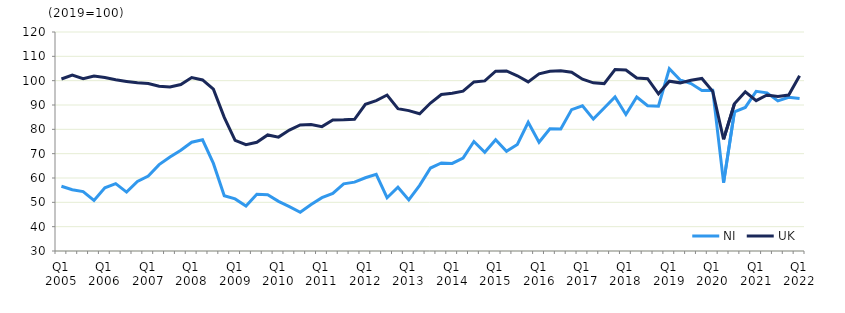
| Category | NI | UK  |
|---|---|---|
| Q1 2005 | 56.6 | 100.7 |
|  | 55.2 | 102.3 |
| Q3 2005 | 54.4 | 100.8 |
|  | 50.8 | 101.9 |
| Q1 2006 | 56 | 101.3 |
|  | 57.7 | 100.4 |
| Q3 2006 | 54.2 | 99.7 |
|  | 58.6 | 99.1 |
| Q1 2007 | 60.8 | 98.8 |
|  | 65.5 | 97.7 |
| Q3 2007 | 68.6 | 97.4 |
|  | 71.4 | 98.4 |
| Q1 2008 | 74.7 | 101.3 |
|  | 75.7 | 100.3 |
| Q3 2008 | 66 | 96.5 |
|  | 52.7 | 84.9 |
| Q1 2009 | 51.4 | 75.5 |
|  | 48.5 | 73.7 |
| Q3 2009 | 53.3 | 74.7 |
|  | 53.1 | 77.7 |
| Q1 2010 | 50.4 | 76.8 |
|  | 48.2 | 79.7 |
| Q3 2010 | 45.9 | 81.8 |
|  | 49.1 | 82 |
| Q1 2011 | 51.9 | 81.1 |
|  | 53.7 | 83.8 |
| Q3 2011 | 57.6 | 83.9 |
|  | 58.3 | 84.1 |
| Q1 2012 | 60.1 | 90.3 |
|  | 61.5 | 91.8 |
| Q3 2012 | 51.9 | 94.1 |
|  | 56.2 | 88.5 |
| Q1 2013 | 51 | 87.7 |
|  | 57 | 86.4 |
| Q3 2013 | 64.1 | 90.8 |
|  | 66.2 | 94.3 |
| Q1 2014 | 66 | 94.8 |
|  | 68.2 | 95.7 |
| Q3 2014 | 75 | 99.5 |
|  | 70.6 | 99.9 |
| Q1 2015 | 75.7 | 103.9 |
|  | 71 | 104 |
| Q3 2015 | 73.8 | 102 |
|  | 82.9 | 99.5 |
| Q1 2016 | 74.7 | 102.8 |
|  | 80.2 | 103.9 |
| Q3 2016 | 80.1 | 104.1 |
|  | 88.1 | 103.5 |
| Q1 2017 | 89.7 | 100.6 |
|  | 84.2 | 99.1 |
| Q3 2017 | 88.8 | 98.8 |
|  | 93.3 | 104.6 |
| Q1 2018 | 86.1 | 104.4 |
|  | 93.3 | 101.1 |
| Q3 2018 | 89.7 | 100.8 |
|  | 89.5 | 94.6 |
| Q1 2019 | 104.9 | 99.8 |
|  | 100.3 | 99.1 |
| Q3 2019 | 98.8 | 100.2 |
|  | 96 | 100.9 |
| Q1 2020 | 96.1 | 95.6 |
|  | 58.1 | 75.9 |
| Q3 2020 | 87.2 | 90.5 |
|  | 89 | 95.4 |
| Q1 2021 | 95.6 | 91.8 |
|  | 95 | 94.1 |
| Q3 2021 | 91.7 | 93.5 |
|  | 93.2 | 94.1 |
| Q1 2022 | 92.7 | 102 |